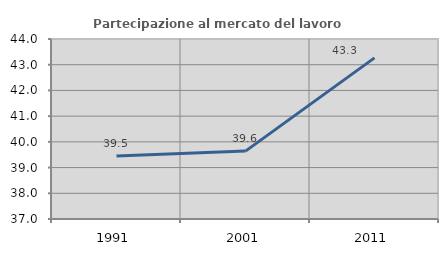
| Category | Partecipazione al mercato del lavoro  femminile |
|---|---|
| 1991.0 | 39.454 |
| 2001.0 | 39.641 |
| 2011.0 | 43.266 |